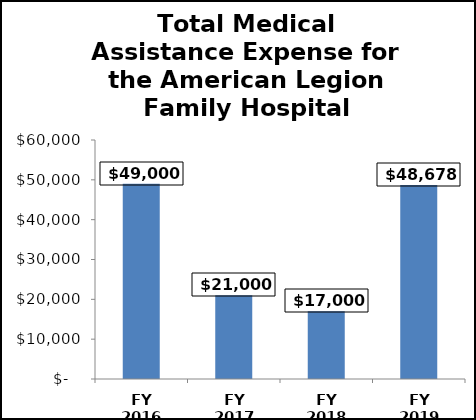
| Category | Series 0 |
|---|---|
| FY 2016 | 49000 |
| FY 2017 | 21000 |
| FY 2018 | 17000 |
| FY 2019 | 48678 |